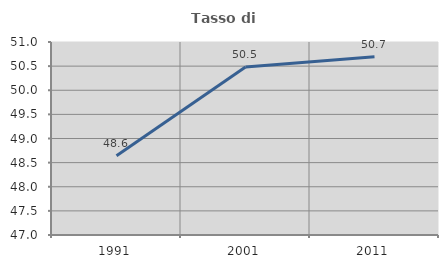
| Category | Tasso di occupazione   |
|---|---|
| 1991.0 | 48.641 |
| 2001.0 | 50.483 |
| 2011.0 | 50.692 |